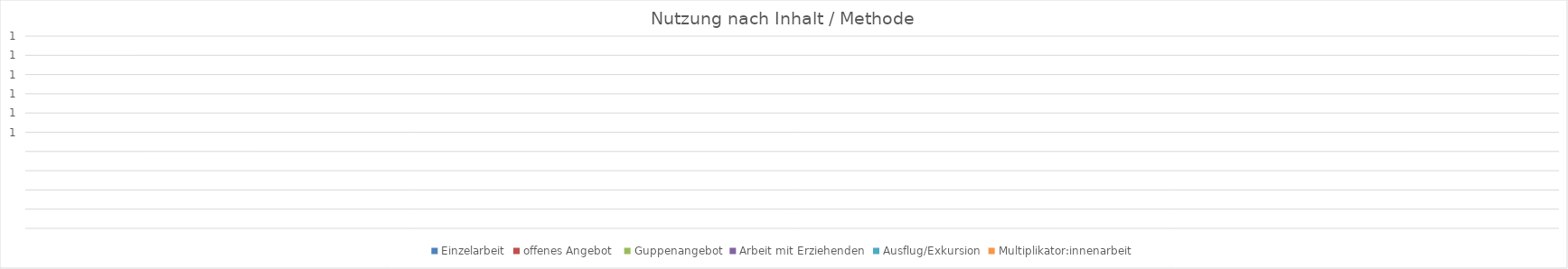
| Category | Einzelarbeit | offenes Angebot  | Guppenangebot | Arbeit mit Erziehenden | Ausflug/Exkursion | Multiplikator:innenarbeit |
|---|---|---|---|---|---|---|
| 0 | 0 | 0 | 0 | 0 | 0 | 0 |